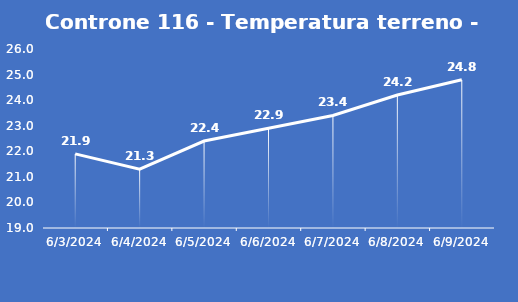
| Category | Controne 116 - Temperatura terreno - Grezzo (°C) |
|---|---|
| 6/3/24 | 21.9 |
| 6/4/24 | 21.3 |
| 6/5/24 | 22.4 |
| 6/6/24 | 22.9 |
| 6/7/24 | 23.4 |
| 6/8/24 | 24.2 |
| 6/9/24 | 24.8 |